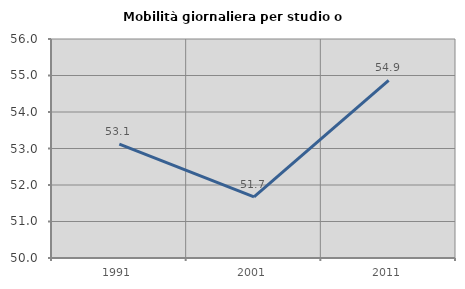
| Category | Mobilità giornaliera per studio o lavoro |
|---|---|
| 1991.0 | 53.117 |
| 2001.0 | 51.677 |
| 2011.0 | 54.868 |